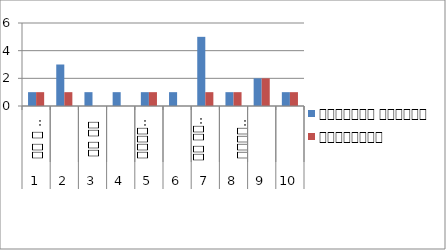
| Category | दरवन्दी सँख्या | पदपूर्ती |
|---|---|---|
| 0 | 1 | 1 |
| 1 | 3 | 1 |
| 2 | 1 | 0 |
| 3 | 1 | 0 |
| 4 | 1 | 1 |
| 5 | 1 | 0 |
| 6 | 5 | 1 |
| 7 | 1 | 1 |
| 8 | 2 | 2 |
| 9 | 1 | 1 |